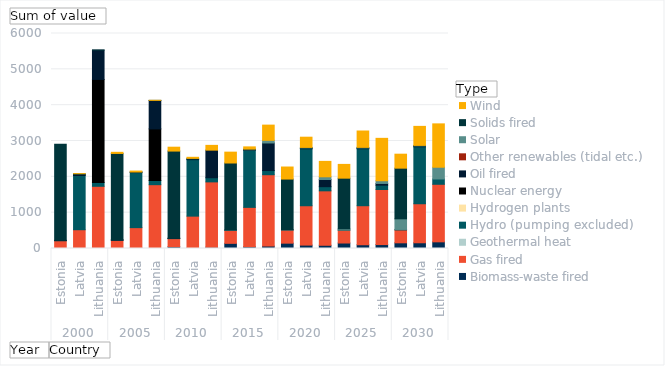
| Category | Biomass-waste fired  | Gas fired  | Geothermal heat  | Hydro (pumping excluded)  | Hydrogen plants  | Nuclear energy  | Oil fired  | Other renewables (tidal etc.)  | Solar  | Solids fired  | Wind  |
|---|---|---|---|---|---|---|---|---|---|---|---|
| 0 | 0 | 218 | 0 | 2 | 0 | 0 | 8 | 0 | 0 | 2684 | 0 |
| 1 | 2 | 522 | 0 | 1513 | 0 | 0 | 27 | 0 | 0 | 23 | 2 |
| 2 | 0 | 1736 | 0 | 103 | 0 | 2880 | 817 | 0 | 0 | 3 | 0 |
| 3 | 5 | 224 | 0 | 5 | 0 | 0 | 8 | 0 | 0 | 2411 | 31 |
| 4 | 10 | 572 | 0 | 1536 | 0 | 0 | 15 | 0 | 0 | 2 | 26 |
| 5 | 0 | 1781 | 0 | 117 | 0 | 1440 | 793 | 0 | 0 | 3 | 1 |
| 6 | 51 | 224 | 0 | 6 | 0 | 0 | 8 | 0 | 0 | 2430 | 108 |
| 7 | 10 | 893 | 0 | 1576 | 0 | 0 | 15 | 0 | 0 | 21 | 30 |
| 8 | 37 | 1822 | 0 | 116 | 0 | 0 | 770 | 0 | 0 | 0 | 133 |
| 9 | 144 | 362 | 0 | 8 | 0 | 0 | 0 | 0 | 1 | 1871 | 303 |
| 10 | 50 | 1098 | 0 | 1589 | 0 | 0 | 15 | 0 | 1 | 21 | 62 |
| 11 | 67 | 1992 | 0 | 116 | 0 | 0 | 770 | 0 | 74 | 0 | 424 |
| 12 | 149 | 367 | 0 | 8 | 0 | 0 | 0 | 0 | 1 | 1413 | 336 |
| 13 | 95 | 1098 | 0 | 1589 | 0 | 0 | 15 | 0 | 3 | 21 | 285 |
| 14 | 90 | 1519 | 0 | 116 | 0 | 0 | 200 | 0 | 76 | 0 | 430 |
| 15 | 153 | 358 | 0 | 8 | 0 | 0 | 0 | 0 | 31 | 1413 | 384 |
| 16 | 105 | 1089 | 0 | 1589 | 0 | 0 | 15 | 0 | 3 | 21 | 457 |
| 17 | 110 | 1537 | 0 | 120 | 0 | 0 | 48 | 0 | 76 | 0 | 1183 |
| 18 | 159 | 358 | 0 | 15 | 0 | 0 | 0 | 0 | 297 | 1413 | 390 |
| 19 | 160 | 1089 | 0 | 1589 | 0 | 0 | 15 | 0 | 3 | 21 | 531 |
| 20 | 186 | 1606 | 0 | 148 | 0 | 0 | 0 | 0 | 328 | 0 | 1210 |